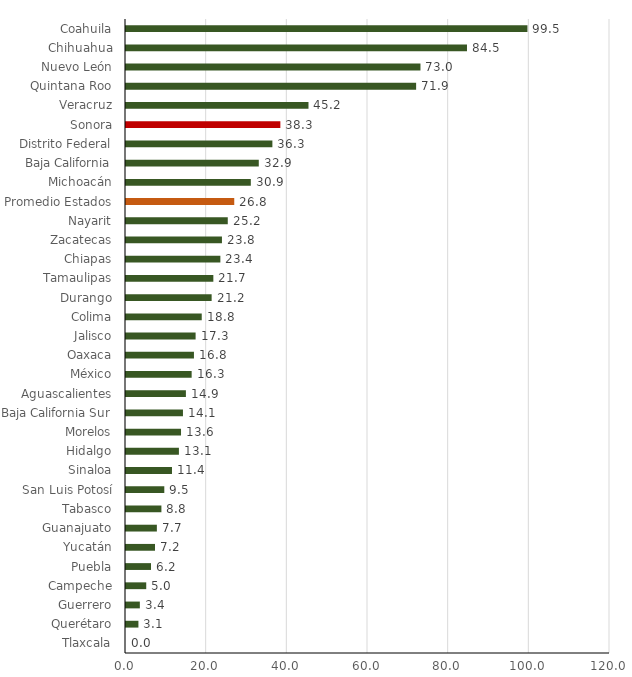
| Category | Proporción Gasto Serv Pers del Total |
|---|---|
| Tlaxcala | 0 |
| Querétaro | 3.08 |
| Guerrero | 3.432 |
| Campeche | 5.018 |
| Puebla | 6.202 |
| Yucatán | 7.192 |
| Guanajuato | 7.654 |
| Tabasco | 8.779 |
| San Luis Potosí | 9.497 |
| Sinaloa | 11.402 |
| Hidalgo | 13.119 |
| Morelos | 13.641 |
| Baja California Sur | 14.122 |
| Aguascalientes | 14.851 |
| México | 16.277 |
| Oaxaca | 16.847 |
| Jalisco | 17.258 |
| Colima | 18.779 |
| Durango | 21.232 |
| Tamaulipas | 21.656 |
| Chiapas | 23.396 |
| Zacatecas | 23.789 |
| Nayarit | 25.232 |
| Promedio Estados | 26.84 |
| Michoacán | 30.947 |
| Baja California | 32.922 |
| Distrito Federal | 36.294 |
| Sonora | 38.27 |
| Veracruz | 45.244 |
| Quintana Roo | 71.932 |
| Nuevo León | 73.009 |
| Chihuahua | 84.543 |
| Coahuila | 99.529 |